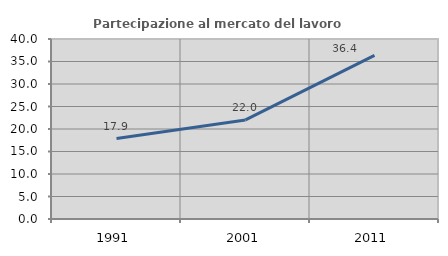
| Category | Partecipazione al mercato del lavoro  femminile |
|---|---|
| 1991.0 | 17.886 |
| 2001.0 | 22.018 |
| 2011.0 | 36.364 |